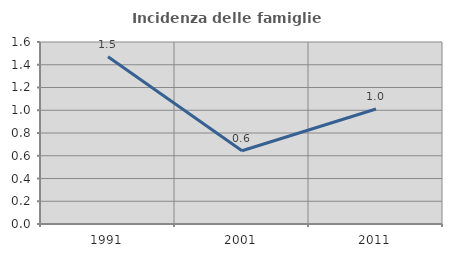
| Category | Incidenza delle famiglie numerose |
|---|---|
| 1991.0 | 1.47 |
| 2001.0 | 0.644 |
| 2011.0 | 1.011 |